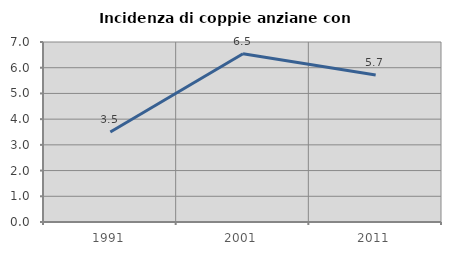
| Category | Incidenza di coppie anziane con figli |
|---|---|
| 1991.0 | 3.503 |
| 2001.0 | 6.545 |
| 2011.0 | 5.714 |